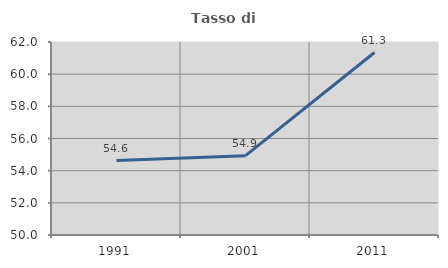
| Category | Tasso di occupazione   |
|---|---|
| 1991.0 | 54.631 |
| 2001.0 | 54.934 |
| 2011.0 | 61.347 |